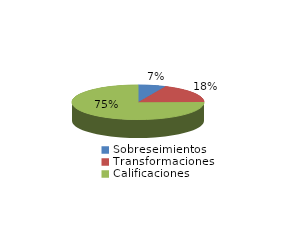
| Category | Series 0 |
|---|---|
| Sobreseimientos | 239 |
| Transformaciones | 637 |
| Calificaciones | 2650 |